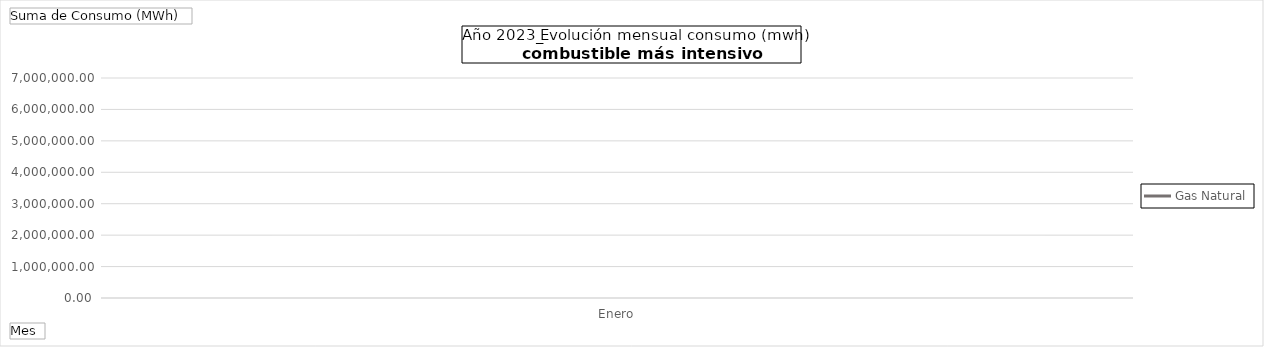
| Category | Gas Natural |
|---|---|
| Enero | 6491613.787 |